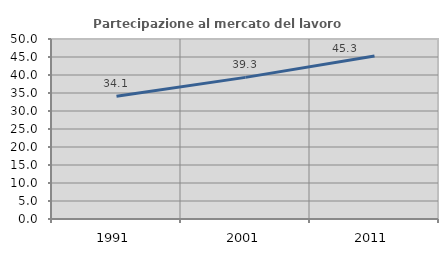
| Category | Partecipazione al mercato del lavoro  femminile |
|---|---|
| 1991.0 | 34.074 |
| 2001.0 | 39.338 |
| 2011.0 | 45.283 |